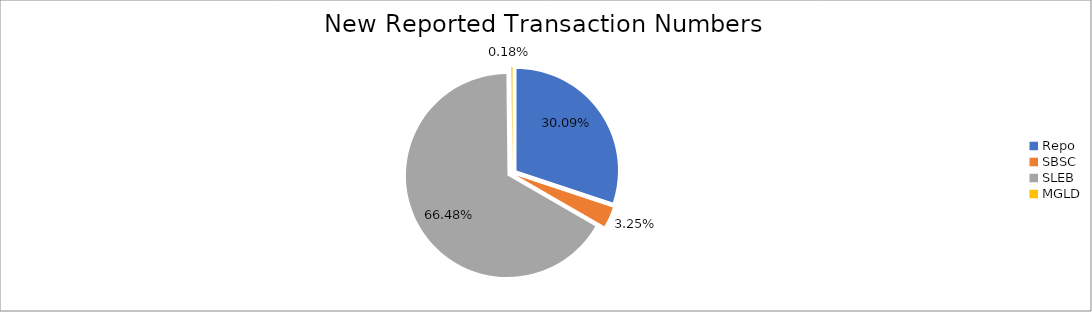
| Category | Series 0 |
|---|---|
| Repo | 433094 |
| SBSC | 46795 |
| SLEB | 956859 |
| MGLD | 2564 |